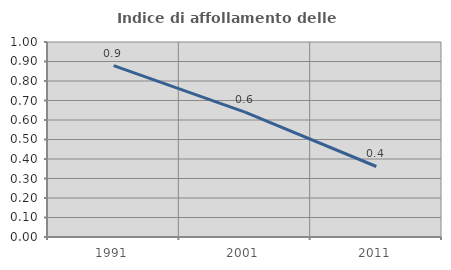
| Category | Indice di affollamento delle abitazioni  |
|---|---|
| 1991.0 | 0.879 |
| 2001.0 | 0.641 |
| 2011.0 | 0.362 |